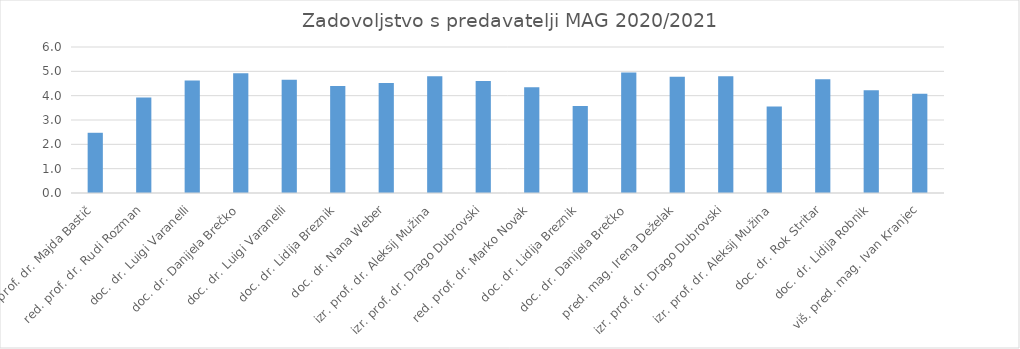
| Category | Series 0 |
|---|---|
| red. prof. dr. Majda Bastič | 2.475 |
| red. prof. dr. Rudi Rozman | 3.925 |
| doc. dr. Luigi Varanelli | 4.625 |
| doc. dr. Danijela Brečko | 4.925 |
| doc. dr. Luigi Varanelli | 4.65 |
| doc. dr. Lidija Breznik | 4.4 |
| doc. dr. Nana Weber | 4.525 |
| izr. prof. dr. Aleksij Mužina | 4.8 |
| izr. prof. dr. Drago Dubrovski | 4.6 |
| red. prof. dr. Marko Novak | 4.35 |
| doc. dr. Lidija Breznik | 3.575 |
| doc. dr. Danijela Brečko | 4.95 |
| pred. mag. Irena Deželak | 4.775 |
| izr. prof. dr. Drago Dubrovski | 4.8 |
| izr. prof. dr. Aleksij Mužina | 3.55 |
| doc. dr. Rok Stritar | 4.675 |
| doc. dr. Lidija Robnik | 4.225 |
| viš. pred. mag. Ivan Kranjec | 4.075 |